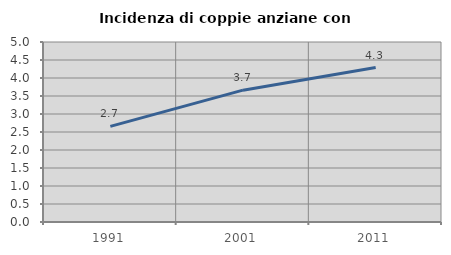
| Category | Incidenza di coppie anziane con figli |
|---|---|
| 1991.0 | 2.655 |
| 2001.0 | 3.663 |
| 2011.0 | 4.29 |